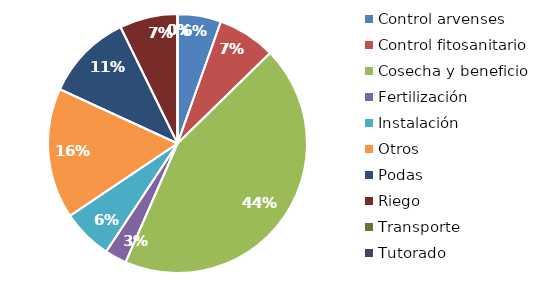
| Category | Valor |
|---|---|
| Control arvenses | 2400000 |
| Control fitosanitario | 3200000 |
| Cosecha y beneficio | 19375000 |
| Fertilización | 1200000 |
| Instalación | 2780000 |
| Otros | 7200000 |
| Podas | 4800000 |
| Riego | 3200000 |
| Transporte | 0 |
| Tutorado | 0 |